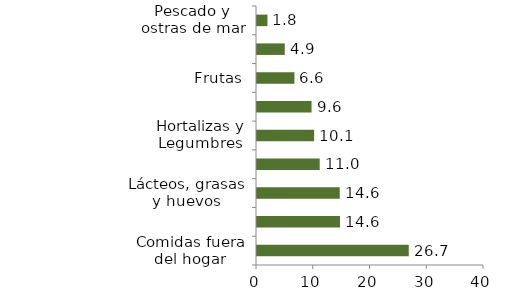
| Category | Alimentos |
|---|---|
| Comidas fuera del hogar | 26.743 |
| Carnes y derivados de la carne | 14.625 |
| Lácteos, grasas y huevos | 14.578 |
| Alimentos varios | 11.045 |
| Hortalizas y Legumbres | 10.067 |
| Cereales y productos de panadería | 9.612 |
| Frutas | 6.596 |
| Tubérculos y plátanos | 4.891 |
| Pescado y ostras de mar | 1.842 |